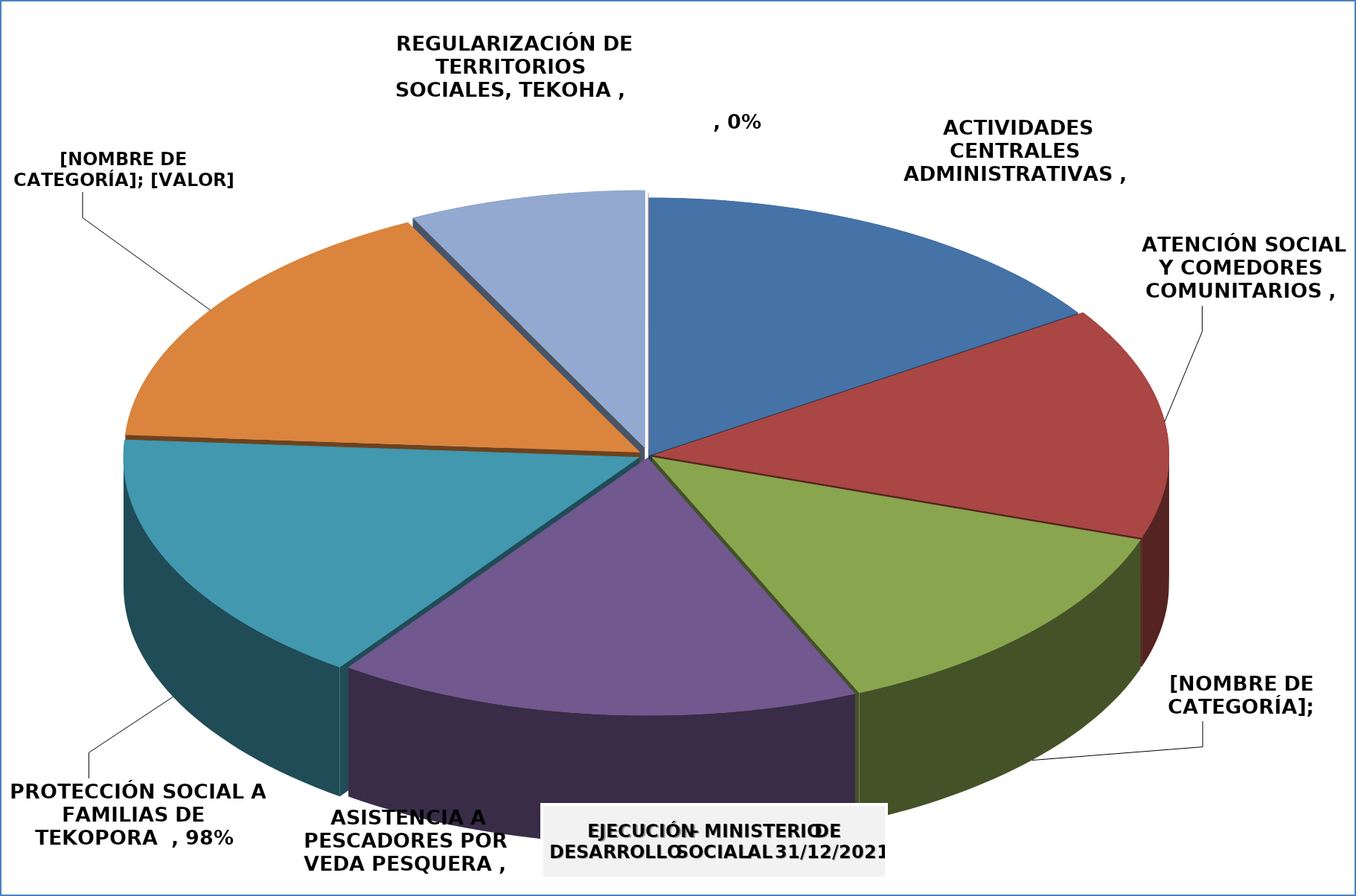
| Category | EJECUCIÓN - MINISTERIO DE DESARROLLO SOCIAL |
|---|---|
| ACTIVIDADES CENTRALES ADMINISTRATIVAS | 0.946 |
| ATENCIÓN SOCIAL Y COMEDORES COMUNITARIOS | 0.877 |
| ATENCIÓN SOCIAL Y COMEDORES COMUNITARIOS - OLLAS POPULARES -FF20 - OF 817 - COVID19 - ADICIONAL | 0.798 |
| ASISTENCIA A PESCADORES POR VEDA PESQUERA | 0.992 |
| PROTECCIÓN SOCIAL A FAMILIAS DE TEKOPORA  | 0.98 |
| FOMENTO DE MICROEMPRENDIMIENTOS A PARTICIPANTES DE TENONDERA | 0.995 |
| REGULARIZACIÓN DE TERRITORIOS SOCIALES, TEKOHA | 0.448 |